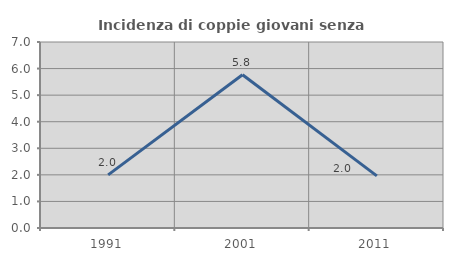
| Category | Incidenza di coppie giovani senza figli |
|---|---|
| 1991.0 | 2 |
| 2001.0 | 5.769 |
| 2011.0 | 1.961 |